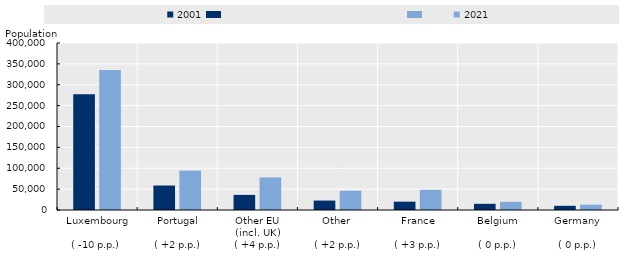
| Category | 2001 | 2021 |
|---|---|---|
| Luxembourg

( -10 p.p.)  | 277200 | 335304 |
| Portugal

( +2 p.p.) | 58657 | 94335 |
| Other EU
(incl. UK)
( +4 p.p.) | 36203 | 78052 |
| Other 

( +2 p.p.) | 22609 | 46139 |
| France

( +3 p.p.) | 19979 | 48502 |
| Belgium

( 0 p.p.) | 14800 | 19613 |
| Germany

( 0 p.p.) | 10052 | 12785 |